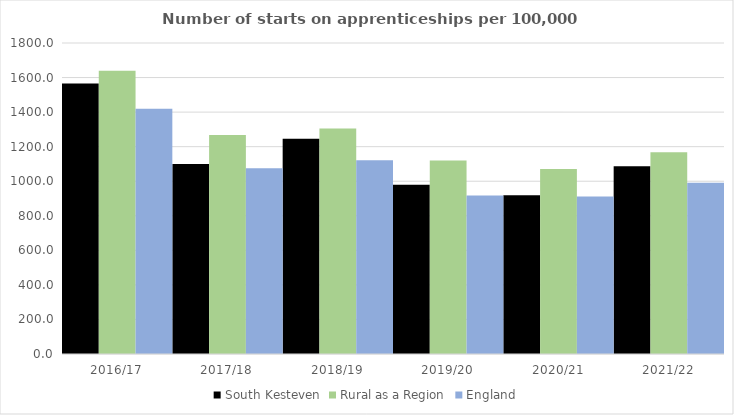
| Category | South Kesteven | Rural as a Region | England |
|---|---|---|---|
| 2016/17 | 1566 | 1638.789 | 1420 |
| 2017/18 | 1099 | 1267.474 | 1075 |
| 2018/19 | 1246 | 1304.57 | 1122 |
| 2019/20 | 980 | 1119.662 | 918 |
| 2020/21 | 919 | 1070.748 | 912 |
| 2021/22 | 1086 | 1167.68 | 991 |